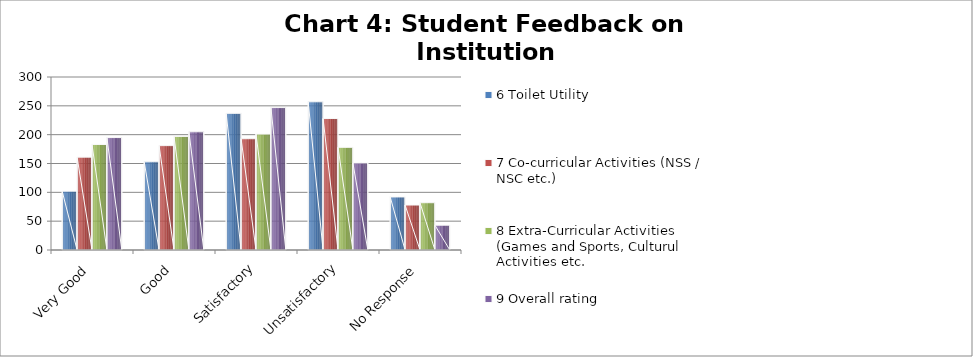
| Category | 6 Toilet Utility | 7 Co-curricular Activities (NSS / NSC etc.) | 8 Extra-Curricular Activities (Games and Sports, Culturul Activities etc. | 9 Overall rating |
|---|---|---|---|---|
| Very Good | 102 | 161 | 183 | 195 |
| Good | 153 | 181 | 197 | 205 |
| Satisfactory | 237 | 193 | 201 | 247 |
| Unsatisfactory | 257 | 228 | 178 | 151 |
| No Response | 92 | 78 | 82 | 43 |